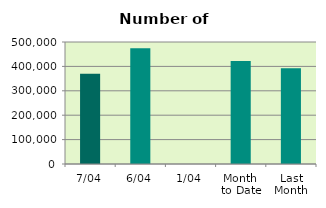
| Category | Series 0 |
|---|---|
| 7/04 | 370128 |
| 6/04 | 473996 |
| 1/04 | 0 |
| Month 
to Date | 422062 |
| Last
Month | 392496.174 |